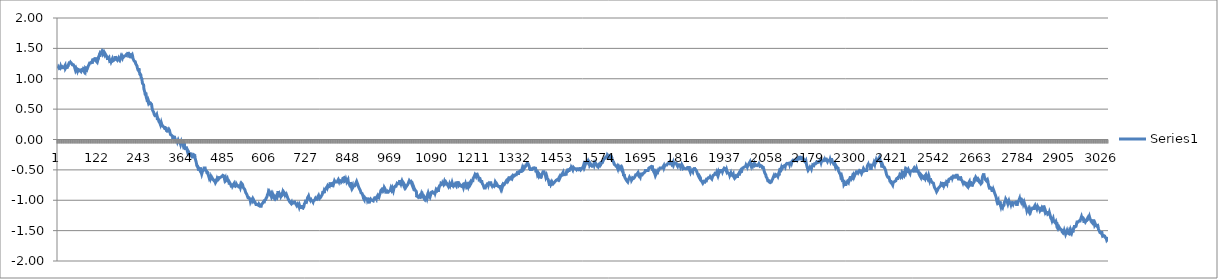
| Category | Series 0 |
|---|---|
| 0 | 1.17 |
| 1 | 1.19 |
| 2 | 1.19 |
| 3 | 1.17 |
| 4 | 1.17 |
| 5 | 1.18 |
| 6 | 1.18 |
| 7 | 1.2 |
| 8 | 1.18 |
| 9 | 1.18 |
| 10 | 1.18 |
| 11 | 1.2 |
| 12 | 1.2 |
| 13 | 1.21 |
| 14 | 1.18 |
| 15 | 1.18 |
| 16 | 1.18 |
| 17 | 1.18 |
| 18 | 1.2 |
| 19 | 1.2 |
| 20 | 1.22 |
| 21 | 1.17 |
| 22 | 1.18 |
| 23 | 1.19 |
| 24 | 1.22 |
| 25 | 1.17 |
| 26 | 1.18 |
| 27 | 1.22 |
| 28 | 1.2 |
| 29 | 1.23 |
| 30 | 1.24 |
| 31 | 1.25 |
| 32 | 1.25 |
| 33 | 1.28 |
| 34 | 1.24 |
| 35 | 1.23 |
| 36 | 1.27 |
| 37 | 1.26 |
| 38 | 1.27 |
| 39 | 1.25 |
| 40 | 1.24 |
| 41 | 1.23 |
| 42 | 1.22 |
| 43 | 1.23 |
| 44 | 1.23 |
| 45 | 1.22 |
| 46 | 1.24 |
| 47 | 1.2 |
| 48 | 1.2 |
| 49 | 1.19 |
| 50 | 1.14 |
| 51 | 1.15 |
| 52 | 1.17 |
| 53 | 1.17 |
| 54 | 1.17 |
| 55 | 1.13 |
| 56 | 1.16 |
| 57 | 1.16 |
| 58 | 1.16 |
| 59 | 1.15 |
| 60 | 1.13 |
| 61 | 1.14 |
| 62 | 1.12 |
| 63 | 1.14 |
| 64 | 1.15 |
| 65 | 1.14 |
| 66 | 1.12 |
| 67 | 1.13 |
| 68 | 1.15 |
| 69 | 1.14 |
| 70 | 1.15 |
| 71 | 1.16 |
| 72 | 1.11 |
| 73 | 1.14 |
| 74 | 1.15 |
| 75 | 1.12 |
| 76 | 1.14 |
| 77 | 1.14 |
| 78 | 1.12 |
| 79 | 1.17 |
| 80 | 1.17 |
| 81 | 1.18 |
| 82 | 1.15 |
| 83 | 1.17 |
| 84 | 1.2 |
| 85 | 1.18 |
| 86 | 1.19 |
| 87 | 1.21 |
| 88 | 1.2 |
| 89 | 1.23 |
| 90 | 1.22 |
| 91 | 1.26 |
| 92 | 1.25 |
| 93 | 1.25 |
| 94 | 1.26 |
| 95 | 1.26 |
| 96 | 1.26 |
| 97 | 1.28 |
| 98 | 1.25 |
| 99 | 1.29 |
| 100 | 1.3 |
| 101 | 1.33 |
| 102 | 1.29 |
| 103 | 1.31 |
| 104 | 1.32 |
| 105 | 1.3 |
| 106 | 1.32 |
| 107 | 1.35 |
| 108 | 1.31 |
| 109 | 1.31 |
| 110 | 1.29 |
| 111 | 1.3 |
| 112 | 1.29 |
| 113 | 1.27 |
| 114 | 1.29 |
| 115 | 1.34 |
| 116 | 1.32 |
| 117 | 1.36 |
| 118 | 1.37 |
| 119 | 1.39 |
| 120 | 1.36 |
| 121 | 1.41 |
| 122 | 1.42 |
| 123 | 1.42 |
| 124 | 1.43 |
| 125 | 1.42 |
| 126 | 1.45 |
| 127 | 1.46 |
| 128 | 1.42 |
| 129 | 1.44 |
| 130 | 1.43 |
| 131 | 1.42 |
| 132 | 1.42 |
| 133 | 1.4 |
| 134 | 1.43 |
| 135 | 1.42 |
| 136 | 1.41 |
| 137 | 1.4 |
| 138 | 1.39 |
| 139 | 1.38 |
| 140 | 1.37 |
| 141 | 1.37 |
| 142 | 1.34 |
| 143 | 1.31 |
| 144 | 1.33 |
| 145 | 1.32 |
| 146 | 1.34 |
| 147 | 1.35 |
| 148 | 1.34 |
| 149 | 1.29 |
| 150 | 1.28 |
| 151 | 1.3 |
| 152 | 1.3 |
| 153 | 1.28 |
| 154 | 1.28 |
| 155 | 1.29 |
| 156 | 1.32 |
| 157 | 1.29 |
| 158 | 1.29 |
| 159 | 1.3 |
| 160 | 1.3 |
| 161 | 1.3 |
| 162 | 1.3 |
| 163 | 1.32 |
| 164 | 1.34 |
| 165 | 1.37 |
| 166 | 1.35 |
| 167 | 1.32 |
| 168 | 1.32 |
| 169 | 1.33 |
| 170 | 1.31 |
| 171 | 1.34 |
| 172 | 1.32 |
| 173 | 1.31 |
| 174 | 1.34 |
| 175 | 1.32 |
| 176 | 1.33 |
| 177 | 1.31 |
| 178 | 1.3 |
| 179 | 1.29 |
| 180 | 1.31 |
| 181 | 1.35 |
| 182 | 1.33 |
| 183 | 1.36 |
| 184 | 1.36 |
| 185 | 1.34 |
| 186 | 1.37 |
| 187 | 1.37 |
| 188 | 1.35 |
| 189 | 1.34 |
| 190 | 1.36 |
| 191 | 1.37 |
| 192 | 1.37 |
| 193 | 1.36 |
| 194 | 1.38 |
| 195 | 1.37 |
| 196 | 1.38 |
| 197 | 1.38 |
| 198 | 1.4 |
| 199 | 1.42 |
| 200 | 1.39 |
| 201 | 1.41 |
| 202 | 1.44 |
| 203 | 1.42 |
| 204 | 1.38 |
| 205 | 1.38 |
| 206 | 1.38 |
| 207 | 1.39 |
| 208 | 1.38 |
| 209 | 1.34 |
| 210 | 1.4 |
| 211 | 1.38 |
| 212 | 1.38 |
| 213 | 1.37 |
| 214 | 1.4 |
| 215 | 1.38 |
| 216 | 1.34 |
| 217 | 1.34 |
| 218 | 1.31 |
| 219 | 1.31 |
| 220 | 1.29 |
| 221 | 1.29 |
| 222 | 1.29 |
| 223 | 1.28 |
| 224 | 1.25 |
| 225 | 1.24 |
| 226 | 1.23 |
| 227 | 1.24 |
| 228 | 1.21 |
| 229 | 1.18 |
| 230 | 1.16 |
| 231 | 1.16 |
| 232 | 1.13 |
| 233 | 1.17 |
| 234 | 1.12 |
| 235 | 1.13 |
| 236 | 1.09 |
| 237 | 1.06 |
| 238 | 1.08 |
| 239 | 1.05 |
| 240 | 1.02 |
| 241 | 1.02 |
| 242 | 1 |
| 243 | 0.95 |
| 244 | 0.92 |
| 245 | 0.91 |
| 246 | 0.92 |
| 247 | 0.9 |
| 248 | 0.83 |
| 249 | 0.81 |
| 250 | 0.82 |
| 251 | 0.77 |
| 252 | 0.73 |
| 253 | 0.77 |
| 254 | 0.72 |
| 255 | 0.69 |
| 256 | 0.69 |
| 257 | 0.65 |
| 258 | 0.62 |
| 259 | 0.64 |
| 260 | 0.62 |
| 261 | 0.64 |
| 262 | 0.65 |
| 263 | 0.64 |
| 264 | 0.59 |
| 265 | 0.59 |
| 266 | 0.58 |
| 267 | 0.6 |
| 268 | 0.59 |
| 269 | 0.61 |
| 270 | 0.58 |
| 271 | 0.59 |
| 272 | 0.5 |
| 273 | 0.49 |
| 274 | 0.47 |
| 275 | 0.46 |
| 276 | 0.45 |
| 277 | 0.43 |
| 278 | 0.41 |
| 279 | 0.4 |
| 280 | 0.39 |
| 281 | 0.4 |
| 282 | 0.38 |
| 283 | 0.39 |
| 284 | 0.39 |
| 285 | 0.41 |
| 286 | 0.38 |
| 287 | 0.32 |
| 288 | 0.35 |
| 289 | 0.35 |
| 290 | 0.33 |
| 291 | 0.3 |
| 292 | 0.31 |
| 293 | 0.29 |
| 294 | 0.27 |
| 295 | 0.26 |
| 296 | 0.24 |
| 297 | 0.25 |
| 298 | 0.28 |
| 299 | 0.29 |
| 300 | 0.24 |
| 301 | 0.23 |
| 302 | 0.23 |
| 303 | 0.22 |
| 304 | 0.21 |
| 305 | 0.22 |
| 306 | 0.2 |
| 307 | 0.22 |
| 308 | 0.19 |
| 309 | 0.21 |
| 310 | 0.16 |
| 311 | 0.2 |
| 312 | 0.18 |
| 313 | 0.16 |
| 314 | 0.13 |
| 315 | 0.16 |
| 316 | 0.15 |
| 317 | 0.12 |
| 318 | 0.15 |
| 319 | 0.15 |
| 320 | 0.17 |
| 321 | 0.16 |
| 322 | 0.15 |
| 323 | 0.12 |
| 324 | 0.11 |
| 325 | 0.08 |
| 326 | 0.08 |
| 327 | 0.08 |
| 328 | 0.07 |
| 329 | 0.08 |
| 330 | 0.07 |
| 331 | 0.05 |
| 332 | 0.01 |
| 333 | 0.04 |
| 334 | 0.06 |
| 335 | 0.03 |
| 336 | 0.05 |
| 337 | 0.04 |
| 338 | 0 |
| 339 | 0.01 |
| 340 | -0.01 |
| 341 | -0.03 |
| 342 | -0.03 |
| 343 | -0.03 |
| 344 | -0.02 |
| 345 | -0.04 |
| 346 | -0.04 |
| 347 | -0.01 |
| 348 | -0.01 |
| 349 | -0.04 |
| 350 | -0.05 |
| 351 | -0.04 |
| 352 | -0.04 |
| 353 | -0.04 |
| 354 | -0.08 |
| 355 | -0.06 |
| 356 | -0.04 |
| 357 | -0.06 |
| 358 | -0.03 |
| 359 | -0.04 |
| 360 | -0.07 |
| 361 | -0.09 |
| 362 | -0.08 |
| 363 | -0.05 |
| 364 | -0.06 |
| 365 | -0.07 |
| 366 | -0.13 |
| 367 | -0.15 |
| 368 | -0.17 |
| 369 | -0.16 |
| 370 | -0.12 |
| 371 | -0.14 |
| 372 | -0.16 |
| 373 | -0.17 |
| 374 | -0.2 |
| 375 | -0.18 |
| 376 | -0.19 |
| 377 | -0.2 |
| 378 | -0.25 |
| 379 | -0.22 |
| 380 | -0.23 |
| 381 | -0.26 |
| 382 | -0.25 |
| 383 | -0.27 |
| 384 | -0.24 |
| 385 | -0.25 |
| 386 | -0.24 |
| 387 | -0.26 |
| 388 | -0.29 |
| 389 | -0.29 |
| 390 | -0.28 |
| 391 | -0.29 |
| 392 | -0.25 |
| 393 | -0.25 |
| 394 | -0.24 |
| 395 | -0.26 |
| 396 | -0.31 |
| 397 | -0.3 |
| 398 | -0.32 |
| 399 | -0.37 |
| 400 | -0.38 |
| 401 | -0.43 |
| 402 | -0.43 |
| 403 | -0.44 |
| 404 | -0.46 |
| 405 | -0.48 |
| 406 | -0.51 |
| 407 | -0.48 |
| 408 | -0.49 |
| 409 | -0.5 |
| 410 | -0.49 |
| 411 | -0.46 |
| 412 | -0.51 |
| 413 | -0.5 |
| 414 | -0.55 |
| 415 | -0.57 |
| 416 | -0.56 |
| 417 | -0.53 |
| 418 | -0.5 |
| 419 | -0.49 |
| 420 | -0.49 |
| 421 | -0.5 |
| 422 | -0.47 |
| 423 | -0.47 |
| 424 | -0.46 |
| 425 | -0.47 |
| 426 | -0.5 |
| 427 | -0.51 |
| 428 | -0.49 |
| 429 | -0.52 |
| 430 | -0.54 |
| 431 | -0.56 |
| 432 | -0.53 |
| 433 | -0.57 |
| 434 | -0.58 |
| 435 | -0.6 |
| 436 | -0.61 |
| 437 | -0.64 |
| 438 | -0.63 |
| 439 | -0.62 |
| 440 | -0.64 |
| 441 | -0.62 |
| 442 | -0.64 |
| 443 | -0.63 |
| 444 | -0.62 |
| 445 | -0.63 |
| 446 | -0.64 |
| 447 | -0.64 |
| 448 | -0.66 |
| 449 | -0.66 |
| 450 | -0.67 |
| 451 | -0.68 |
| 452 | -0.65 |
| 453 | -0.67 |
| 454 | -0.68 |
| 455 | -0.71 |
| 456 | -0.7 |
| 457 | -0.7 |
| 458 | -0.68 |
| 459 | -0.66 |
| 460 | -0.68 |
| 461 | -0.64 |
| 462 | -0.61 |
| 463 | -0.62 |
| 464 | -0.65 |
| 465 | -0.65 |
| 466 | -0.64 |
| 467 | -0.63 |
| 468 | -0.63 |
| 469 | -0.64 |
| 470 | -0.62 |
| 471 | -0.62 |
| 472 | -0.63 |
| 473 | -0.61 |
| 474 | -0.6 |
| 475 | -0.6 |
| 476 | -0.59 |
| 477 | -0.58 |
| 478 | -0.6 |
| 479 | -0.6 |
| 480 | -0.61 |
| 481 | -0.65 |
| 482 | -0.64 |
| 483 | -0.63 |
| 484 | -0.68 |
| 485 | -0.67 |
| 486 | -0.68 |
| 487 | -0.66 |
| 488 | -0.67 |
| 489 | -0.64 |
| 490 | -0.66 |
| 491 | -0.68 |
| 492 | -0.69 |
| 493 | -0.69 |
| 494 | -0.71 |
| 495 | -0.74 |
| 496 | -0.71 |
| 497 | -0.72 |
| 498 | -0.72 |
| 499 | -0.74 |
| 500 | -0.76 |
| 501 | -0.76 |
| 502 | -0.75 |
| 503 | -0.75 |
| 504 | -0.77 |
| 505 | -0.76 |
| 506 | -0.75 |
| 507 | -0.74 |
| 508 | -0.73 |
| 509 | -0.76 |
| 510 | -0.77 |
| 511 | -0.76 |
| 512 | -0.77 |
| 513 | -0.77 |
| 514 | -0.75 |
| 515 | -0.73 |
| 516 | -0.72 |
| 517 | -0.74 |
| 518 | -0.76 |
| 519 | -0.75 |
| 520 | -0.76 |
| 521 | -0.76 |
| 522 | -0.78 |
| 523 | -0.77 |
| 524 | -0.78 |
| 525 | -0.79 |
| 526 | -0.77 |
| 527 | -0.79 |
| 528 | -0.77 |
| 529 | -0.74 |
| 530 | -0.72 |
| 531 | -0.73 |
| 532 | -0.73 |
| 533 | -0.74 |
| 534 | -0.76 |
| 535 | -0.79 |
| 536 | -0.78 |
| 537 | -0.8 |
| 538 | -0.81 |
| 539 | -0.81 |
| 540 | -0.83 |
| 541 | -0.83 |
| 542 | -0.87 |
| 543 | -0.88 |
| 544 | -0.89 |
| 545 | -0.88 |
| 546 | -0.91 |
| 547 | -0.93 |
| 548 | -0.93 |
| 549 | -0.96 |
| 550 | -0.96 |
| 551 | -0.96 |
| 552 | -0.96 |
| 553 | -0.97 |
| 554 | -0.97 |
| 555 | -0.99 |
| 556 | -1.02 |
| 557 | -1.01 |
| 558 | -0.99 |
| 559 | -0.96 |
| 560 | -0.98 |
| 561 | -1 |
| 562 | -0.99 |
| 563 | -0.97 |
| 564 | -0.97 |
| 565 | -0.99 |
| 566 | -1.03 |
| 567 | -1.04 |
| 568 | -1.04 |
| 569 | -1.03 |
| 570 | -1.04 |
| 571 | -1.03 |
| 572 | -1.07 |
| 573 | -1.06 |
| 574 | -1.06 |
| 575 | -1.07 |
| 576 | -1.07 |
| 577 | -1.08 |
| 578 | -1.08 |
| 579 | -1.07 |
| 580 | -1.06 |
| 581 | -1.07 |
| 582 | -1.08 |
| 583 | -1.08 |
| 584 | -1.1 |
| 585 | -1.11 |
| 586 | -1.11 |
| 587 | -1.1 |
| 588 | -1.07 |
| 589 | -1.08 |
| 590 | -1.08 |
| 591 | -1.05 |
| 592 | -1.05 |
| 593 | -1.03 |
| 594 | -1.04 |
| 595 | -1.02 |
| 596 | -1.03 |
| 597 | -1 |
| 598 | -1.01 |
| 599 | -1 |
| 600 | -0.99 |
| 601 | -0.97 |
| 602 | -0.98 |
| 603 | -0.98 |
| 604 | -0.94 |
| 605 | -0.91 |
| 606 | -0.92 |
| 607 | -0.89 |
| 608 | -0.86 |
| 609 | -0.86 |
| 610 | -0.88 |
| 611 | -0.86 |
| 612 | -0.86 |
| 613 | -0.88 |
| 614 | -0.89 |
| 615 | -0.89 |
| 616 | -0.93 |
| 617 | -0.91 |
| 618 | -0.93 |
| 619 | -0.92 |
| 620 | -0.9 |
| 621 | -0.92 |
| 622 | -0.94 |
| 623 | -0.93 |
| 624 | -0.96 |
| 625 | -0.94 |
| 626 | -0.94 |
| 627 | -0.95 |
| 628 | -0.97 |
| 629 | -0.97 |
| 630 | -0.96 |
| 631 | -0.93 |
| 632 | -0.94 |
| 633 | -0.95 |
| 634 | -0.95 |
| 635 | -0.91 |
| 636 | -0.85 |
| 637 | -0.87 |
| 638 | -0.92 |
| 639 | -0.95 |
| 640 | -0.95 |
| 641 | -0.9 |
| 642 | -0.9 |
| 643 | -0.92 |
| 644 | -0.94 |
| 645 | -0.93 |
| 646 | -0.94 |
| 647 | -0.91 |
| 648 | -0.9 |
| 649 | -0.87 |
| 650 | -0.89 |
| 651 | -0.89 |
| 652 | -0.87 |
| 653 | -0.87 |
| 654 | -0.87 |
| 655 | -0.91 |
| 656 | -0.89 |
| 657 | -0.9 |
| 658 | -0.89 |
| 659 | -0.91 |
| 660 | -0.94 |
| 661 | -0.92 |
| 662 | -0.92 |
| 663 | -0.95 |
| 664 | -0.96 |
| 665 | -0.98 |
| 666 | -0.97 |
| 667 | -0.97 |
| 668 | -1.01 |
| 669 | -1.01 |
| 670 | -1.03 |
| 671 | -1.02 |
| 672 | -1.03 |
| 673 | -1.05 |
| 674 | -1.04 |
| 675 | -1.03 |
| 676 | -1.05 |
| 677 | -1.04 |
| 678 | -1.04 |
| 679 | -1.03 |
| 680 | -1.01 |
| 681 | -1.04 |
| 682 | -1.04 |
| 683 | -1.03 |
| 684 | -1.03 |
| 685 | -1.02 |
| 686 | -1.04 |
| 687 | -1.06 |
| 688 | -1.07 |
| 689 | -1.06 |
| 690 | -1.09 |
| 691 | -1.09 |
| 692 | -1.1 |
| 693 | -1.06 |
| 694 | -1.06 |
| 695 | -1.06 |
| 696 | -1.09 |
| 697 | -1.11 |
| 698 | -1.09 |
| 699 | -1.11 |
| 700 | -1.11 |
| 701 | -1.14 |
| 702 | -1.09 |
| 703 | -1.12 |
| 704 | -1.08 |
| 705 | -1.12 |
| 706 | -1.13 |
| 707 | -1.13 |
| 708 | -1.13 |
| 709 | -1.12 |
| 710 | -1.11 |
| 711 | -1.1 |
| 712 | -1.06 |
| 713 | -1.06 |
| 714 | -1.04 |
| 715 | -1.02 |
| 716 | -1.02 |
| 717 | -1.03 |
| 718 | -1.03 |
| 719 | -1.04 |
| 720 | -0.99 |
| 721 | -0.96 |
| 722 | -0.96 |
| 723 | -0.94 |
| 724 | -0.97 |
| 725 | -0.95 |
| 726 | -0.97 |
| 727 | -0.97 |
| 728 | -0.99 |
| 729 | -0.96 |
| 730 | -0.98 |
| 731 | -0.98 |
| 732 | -1 |
| 733 | -1.01 |
| 734 | -1 |
| 735 | -1.01 |
| 736 | -1.01 |
| 737 | -1.03 |
| 738 | -1.01 |
| 739 | -1.01 |
| 740 | -1 |
| 741 | -1 |
| 742 | -0.99 |
| 743 | -0.98 |
| 744 | -1 |
| 745 | -0.97 |
| 746 | -0.97 |
| 747 | -0.98 |
| 748 | -0.98 |
| 749 | -0.98 |
| 750 | -0.95 |
| 751 | -0.94 |
| 752 | -0.96 |
| 753 | -0.92 |
| 754 | -0.93 |
| 755 | -0.91 |
| 756 | -0.97 |
| 757 | -0.96 |
| 758 | -0.98 |
| 759 | -0.95 |
| 760 | -0.95 |
| 761 | -0.93 |
| 762 | -0.94 |
| 763 | -0.91 |
| 764 | -0.91 |
| 765 | -0.88 |
| 766 | -0.85 |
| 767 | -0.88 |
| 768 | -0.86 |
| 769 | -0.88 |
| 770 | -0.85 |
| 771 | -0.86 |
| 772 | -0.84 |
| 773 | -0.81 |
| 774 | -0.81 |
| 775 | -0.82 |
| 776 | -0.79 |
| 777 | -0.79 |
| 778 | -0.77 |
| 779 | -0.79 |
| 780 | -0.78 |
| 781 | -0.76 |
| 782 | -0.76 |
| 783 | -0.77 |
| 784 | -0.77 |
| 785 | -0.74 |
| 786 | -0.76 |
| 787 | -0.71 |
| 788 | -0.75 |
| 789 | -0.78 |
| 790 | -0.77 |
| 791 | -0.73 |
| 792 | -0.72 |
| 793 | -0.72 |
| 794 | -0.72 |
| 795 | -0.72 |
| 796 | -0.74 |
| 797 | -0.73 |
| 798 | -0.7 |
| 799 | -0.68 |
| 800 | -0.67 |
| 801 | -0.7 |
| 802 | -0.71 |
| 803 | -0.71 |
| 804 | -0.7 |
| 805 | -0.71 |
| 806 | -0.7 |
| 807 | -0.7 |
| 808 | -0.68 |
| 809 | -0.68 |
| 810 | -0.66 |
| 811 | -0.67 |
| 812 | -0.69 |
| 813 | -0.67 |
| 814 | -0.66 |
| 815 | -0.68 |
| 816 | -0.68 |
| 817 | -0.71 |
| 818 | -0.68 |
| 819 | -0.7 |
| 820 | -0.71 |
| 821 | -0.69 |
| 822 | -0.68 |
| 823 | -0.64 |
| 824 | -0.65 |
| 825 | -0.63 |
| 826 | -0.63 |
| 827 | -0.65 |
| 828 | -0.69 |
| 829 | -0.68 |
| 830 | -0.68 |
| 831 | -0.68 |
| 832 | -0.66 |
| 833 | -0.68 |
| 834 | -0.65 |
| 835 | -0.69 |
| 836 | -0.68 |
| 837 | -0.68 |
| 838 | -0.66 |
| 839 | -0.7 |
| 840 | -0.7 |
| 841 | -0.71 |
| 842 | -0.74 |
| 843 | -0.74 |
| 844 | -0.73 |
| 845 | -0.7 |
| 846 | -0.75 |
| 847 | -0.76 |
| 848 | -0.79 |
| 849 | -0.77 |
| 850 | -0.77 |
| 851 | -0.75 |
| 852 | -0.79 |
| 853 | -0.78 |
| 854 | -0.78 |
| 855 | -0.76 |
| 856 | -0.76 |
| 857 | -0.75 |
| 858 | -0.76 |
| 859 | -0.75 |
| 860 | -0.73 |
| 861 | -0.74 |
| 862 | -0.73 |
| 863 | -0.69 |
| 864 | -0.7 |
| 865 | -0.72 |
| 866 | -0.72 |
| 867 | -0.75 |
| 868 | -0.77 |
| 869 | -0.77 |
| 870 | -0.8 |
| 871 | -0.79 |
| 872 | -0.81 |
| 873 | -0.83 |
| 874 | -0.83 |
| 875 | -0.84 |
| 876 | -0.88 |
| 877 | -0.87 |
| 878 | -0.88 |
| 879 | -0.89 |
| 880 | -0.89 |
| 881 | -0.9 |
| 882 | -0.94 |
| 883 | -0.97 |
| 884 | -0.98 |
| 885 | -0.99 |
| 886 | -0.95 |
| 887 | -0.96 |
| 888 | -0.96 |
| 889 | -0.97 |
| 890 | -0.98 |
| 891 | -0.97 |
| 892 | -0.98 |
| 893 | -0.96 |
| 894 | -0.99 |
| 895 | -0.99 |
| 896 | -0.96 |
| 897 | -1 |
| 898 | -1 |
| 899 | -1.05 |
| 900 | -1 |
| 901 | -1.01 |
| 902 | -1.01 |
| 903 | -0.98 |
| 904 | -0.98 |
| 905 | -1 |
| 906 | -1 |
| 907 | -0.99 |
| 908 | -1 |
| 909 | -1 |
| 910 | -1.01 |
| 911 | -1.01 |
| 912 | -0.99 |
| 913 | -0.99 |
| 914 | -0.99 |
| 915 | -0.96 |
| 916 | -0.95 |
| 917 | -0.97 |
| 918 | -0.96 |
| 919 | -0.97 |
| 920 | -0.98 |
| 921 | -0.95 |
| 922 | -0.95 |
| 923 | -0.93 |
| 924 | -0.95 |
| 925 | -0.96 |
| 926 | -0.96 |
| 927 | -0.96 |
| 928 | -0.94 |
| 929 | -0.94 |
| 930 | -0.9 |
| 931 | -0.9 |
| 932 | -0.87 |
| 933 | -0.84 |
| 934 | -0.83 |
| 935 | -0.84 |
| 936 | -0.82 |
| 937 | -0.82 |
| 938 | -0.83 |
| 939 | -0.85 |
| 940 | -0.85 |
| 941 | -0.84 |
| 942 | -0.82 |
| 943 | -0.79 |
| 944 | -0.8 |
| 945 | -0.81 |
| 946 | -0.82 |
| 947 | -0.86 |
| 948 | -0.85 |
| 949 | -0.85 |
| 950 | -0.85 |
| 951 | -0.87 |
| 952 | -0.86 |
| 953 | -0.86 |
| 954 | -0.87 |
| 955 | -0.86 |
| 956 | -0.86 |
| 957 | -0.85 |
| 958 | -0.85 |
| 959 | -0.86 |
| 960 | -0.84 |
| 961 | -0.83 |
| 962 | -0.8 |
| 963 | -0.81 |
| 964 | -0.83 |
| 965 | -0.82 |
| 966 | -0.8 |
| 967 | -0.82 |
| 968 | -0.82 |
| 969 | -0.85 |
| 970 | -0.84 |
| 971 | -0.8 |
| 972 | -0.8 |
| 973 | -0.79 |
| 974 | -0.77 |
| 975 | -0.76 |
| 976 | -0.78 |
| 977 | -0.77 |
| 978 | -0.77 |
| 979 | -0.76 |
| 980 | -0.72 |
| 981 | -0.71 |
| 982 | -0.71 |
| 983 | -0.73 |
| 984 | -0.72 |
| 985 | -0.73 |
| 986 | -0.73 |
| 987 | -0.69 |
| 988 | -0.67 |
| 989 | -0.7 |
| 990 | -0.71 |
| 991 | -0.73 |
| 992 | -0.71 |
| 993 | -0.7 |
| 994 | -0.68 |
| 995 | -0.69 |
| 996 | -0.71 |
| 997 | -0.73 |
| 998 | -0.74 |
| 999 | -0.73 |
| 1000 | -0.77 |
| 1001 | -0.74 |
| 1002 | -0.74 |
| 1003 | -0.76 |
| 1004 | -0.75 |
| 1005 | -0.79 |
| 1006 | -0.78 |
| 1007 | -0.77 |
| 1008 | -0.77 |
| 1009 | -0.77 |
| 1010 | -0.75 |
| 1011 | -0.74 |
| 1012 | -0.74 |
| 1013 | -0.71 |
| 1014 | -0.72 |
| 1015 | -0.68 |
| 1016 | -0.69 |
| 1017 | -0.7 |
| 1018 | -0.7 |
| 1019 | -0.7 |
| 1020 | -0.69 |
| 1021 | -0.7 |
| 1022 | -0.7 |
| 1023 | -0.74 |
| 1024 | -0.74 |
| 1025 | -0.77 |
| 1026 | -0.75 |
| 1027 | -0.74 |
| 1028 | -0.78 |
| 1029 | -0.78 |
| 1030 | -0.82 |
| 1031 | -0.85 |
| 1032 | -0.83 |
| 1033 | -0.84 |
| 1034 | -0.84 |
| 1035 | -0.85 |
| 1036 | -0.87 |
| 1037 | -0.95 |
| 1038 | -0.93 |
| 1039 | -0.94 |
| 1040 | -0.93 |
| 1041 | -0.95 |
| 1042 | -0.96 |
| 1043 | -0.96 |
| 1044 | -0.93 |
| 1045 | -0.97 |
| 1046 | -0.96 |
| 1047 | -0.94 |
| 1048 | -0.94 |
| 1049 | -0.92 |
| 1050 | -0.9 |
| 1051 | -0.92 |
| 1052 | -0.91 |
| 1053 | -0.9 |
| 1054 | -0.92 |
| 1055 | -0.94 |
| 1056 | -0.94 |
| 1057 | -0.94 |
| 1058 | -0.97 |
| 1059 | -0.95 |
| 1060 | -0.95 |
| 1061 | -0.96 |
| 1062 | -0.98 |
| 1063 | -0.96 |
| 1064 | -0.93 |
| 1065 | -0.97 |
| 1066 | -0.95 |
| 1067 | -0.97 |
| 1068 | -0.95 |
| 1069 | -0.9 |
| 1070 | -0.88 |
| 1071 | -0.88 |
| 1072 | -0.87 |
| 1073 | -0.93 |
| 1074 | -0.92 |
| 1075 | -0.95 |
| 1076 | -0.94 |
| 1077 | -0.91 |
| 1078 | -0.89 |
| 1079 | -0.87 |
| 1080 | -0.87 |
| 1081 | -0.88 |
| 1082 | -0.86 |
| 1083 | -0.85 |
| 1084 | -0.86 |
| 1085 | -0.88 |
| 1086 | -0.87 |
| 1087 | -0.88 |
| 1088 | -0.89 |
| 1089 | -0.86 |
| 1090 | -0.88 |
| 1091 | -0.89 |
| 1092 | -0.84 |
| 1093 | -0.82 |
| 1094 | -0.83 |
| 1095 | -0.81 |
| 1096 | -0.84 |
| 1097 | -0.83 |
| 1098 | -0.82 |
| 1099 | -0.86 |
| 1100 | -0.82 |
| 1101 | -0.8 |
| 1102 | -0.79 |
| 1103 | -0.76 |
| 1104 | -0.77 |
| 1105 | -0.77 |
| 1106 | -0.75 |
| 1107 | -0.72 |
| 1108 | -0.71 |
| 1109 | -0.73 |
| 1110 | -0.73 |
| 1111 | -0.75 |
| 1112 | -0.72 |
| 1113 | -0.73 |
| 1114 | -0.74 |
| 1115 | -0.73 |
| 1116 | -0.71 |
| 1117 | -0.69 |
| 1118 | -0.7 |
| 1119 | -0.72 |
| 1120 | -0.72 |
| 1121 | -0.7 |
| 1122 | -0.7 |
| 1123 | -0.72 |
| 1124 | -0.73 |
| 1125 | -0.73 |
| 1126 | -0.75 |
| 1127 | -0.75 |
| 1128 | -0.77 |
| 1129 | -0.75 |
| 1130 | -0.76 |
| 1131 | -0.75 |
| 1132 | -0.77 |
| 1133 | -0.73 |
| 1134 | -0.74 |
| 1135 | -0.75 |
| 1136 | -0.78 |
| 1137 | -0.76 |
| 1138 | -0.73 |
| 1139 | -0.71 |
| 1140 | -0.72 |
| 1141 | -0.75 |
| 1142 | -0.74 |
| 1143 | -0.77 |
| 1144 | -0.77 |
| 1145 | -0.76 |
| 1146 | -0.75 |
| 1147 | -0.74 |
| 1148 | -0.73 |
| 1149 | -0.72 |
| 1150 | -0.73 |
| 1151 | -0.76 |
| 1152 | -0.74 |
| 1153 | -0.71 |
| 1154 | -0.74 |
| 1155 | -0.71 |
| 1156 | -0.69 |
| 1157 | -0.73 |
| 1158 | -0.76 |
| 1159 | -0.77 |
| 1160 | -0.77 |
| 1161 | -0.74 |
| 1162 | -0.74 |
| 1163 | -0.76 |
| 1164 | -0.75 |
| 1165 | -0.77 |
| 1166 | -0.77 |
| 1167 | -0.77 |
| 1168 | -0.76 |
| 1169 | -0.75 |
| 1170 | -0.76 |
| 1171 | -0.77 |
| 1172 | -0.79 |
| 1173 | -0.77 |
| 1174 | -0.77 |
| 1175 | -0.71 |
| 1176 | -0.77 |
| 1177 | -0.75 |
| 1178 | -0.73 |
| 1179 | -0.74 |
| 1180 | -0.77 |
| 1181 | -0.76 |
| 1182 | -0.75 |
| 1183 | -0.77 |
| 1184 | -0.77 |
| 1185 | -0.75 |
| 1186 | -0.77 |
| 1187 | -0.75 |
| 1188 | -0.75 |
| 1189 | -0.73 |
| 1190 | -0.73 |
| 1191 | -0.71 |
| 1192 | -0.74 |
| 1193 | -0.73 |
| 1194 | -0.72 |
| 1195 | -0.7 |
| 1196 | -0.68 |
| 1197 | -0.68 |
| 1198 | -0.68 |
| 1199 | -0.68 |
| 1200 | -0.64 |
| 1201 | -0.65 |
| 1202 | -0.64 |
| 1203 | -0.61 |
| 1204 | -0.62 |
| 1205 | -0.58 |
| 1206 | -0.59 |
| 1207 | -0.58 |
| 1208 | -0.61 |
| 1209 | -0.59 |
| 1210 | -0.55 |
| 1211 | -0.57 |
| 1212 | -0.58 |
| 1213 | -0.59 |
| 1214 | -0.61 |
| 1215 | -0.6 |
| 1216 | -0.63 |
| 1217 | -0.66 |
| 1218 | -0.65 |
| 1219 | -0.66 |
| 1220 | -0.65 |
| 1221 | -0.66 |
| 1222 | -0.69 |
| 1223 | -0.7 |
| 1224 | -0.69 |
| 1225 | -0.69 |
| 1226 | -0.72 |
| 1227 | -0.72 |
| 1228 | -0.71 |
| 1229 | -0.75 |
| 1230 | -0.74 |
| 1231 | -0.75 |
| 1232 | -0.8 |
| 1233 | -0.79 |
| 1234 | -0.8 |
| 1235 | -0.8 |
| 1236 | -0.78 |
| 1237 | -0.78 |
| 1238 | -0.76 |
| 1239 | -0.78 |
| 1240 | -0.75 |
| 1241 | -0.75 |
| 1242 | -0.74 |
| 1243 | -0.73 |
| 1244 | -0.75 |
| 1245 | -0.73 |
| 1246 | -0.74 |
| 1247 | -0.73 |
| 1248 | -0.71 |
| 1249 | -0.7 |
| 1250 | -0.72 |
| 1251 | -0.71 |
| 1252 | -0.74 |
| 1253 | -0.74 |
| 1254 | -0.76 |
| 1255 | -0.74 |
| 1256 | -0.78 |
| 1257 | -0.76 |
| 1258 | -0.77 |
| 1259 | -0.76 |
| 1260 | -0.77 |
| 1261 | -0.75 |
| 1262 | -0.75 |
| 1263 | -0.73 |
| 1264 | -0.7 |
| 1265 | -0.71 |
| 1266 | -0.72 |
| 1267 | -0.73 |
| 1268 | -0.75 |
| 1269 | -0.78 |
| 1270 | -0.75 |
| 1271 | -0.75 |
| 1272 | -0.77 |
| 1273 | -0.77 |
| 1274 | -0.76 |
| 1275 | -0.78 |
| 1276 | -0.78 |
| 1277 | -0.75 |
| 1278 | -0.79 |
| 1279 | -0.78 |
| 1280 | -0.82 |
| 1281 | -0.81 |
| 1282 | -0.79 |
| 1283 | -0.81 |
| 1284 | -0.79 |
| 1285 | -0.79 |
| 1286 | -0.78 |
| 1287 | -0.73 |
| 1288 | -0.73 |
| 1289 | -0.73 |
| 1290 | -0.74 |
| 1291 | -0.74 |
| 1292 | -0.72 |
| 1293 | -0.73 |
| 1294 | -0.71 |
| 1295 | -0.69 |
| 1296 | -0.68 |
| 1297 | -0.72 |
| 1298 | -0.68 |
| 1299 | -0.69 |
| 1300 | -0.66 |
| 1301 | -0.68 |
| 1302 | -0.67 |
| 1303 | -0.66 |
| 1304 | -0.63 |
| 1305 | -0.63 |
| 1306 | -0.62 |
| 1307 | -0.63 |
| 1308 | -0.67 |
| 1309 | -0.66 |
| 1310 | -0.62 |
| 1311 | -0.61 |
| 1312 | -0.61 |
| 1313 | -0.6 |
| 1314 | -0.62 |
| 1315 | -0.61 |
| 1316 | -0.59 |
| 1317 | -0.58 |
| 1318 | -0.6 |
| 1319 | -0.6 |
| 1320 | -0.61 |
| 1321 | -0.6 |
| 1322 | -0.58 |
| 1323 | -0.59 |
| 1324 | -0.57 |
| 1325 | -0.58 |
| 1326 | -0.58 |
| 1327 | -0.55 |
| 1328 | -0.56 |
| 1329 | -0.55 |
| 1330 | -0.56 |
| 1331 | -0.58 |
| 1332 | -0.53 |
| 1333 | -0.52 |
| 1334 | -0.52 |
| 1335 | -0.53 |
| 1336 | -0.55 |
| 1337 | -0.5 |
| 1338 | -0.54 |
| 1339 | -0.51 |
| 1340 | -0.51 |
| 1341 | -0.49 |
| 1342 | -0.47 |
| 1343 | -0.49 |
| 1344 | -0.48 |
| 1345 | -0.5 |
| 1346 | -0.46 |
| 1347 | -0.48 |
| 1348 | -0.47 |
| 1349 | -0.46 |
| 1350 | -0.46 |
| 1351 | -0.46 |
| 1352 | -0.44 |
| 1353 | -0.43 |
| 1354 | -0.42 |
| 1355 | -0.41 |
| 1356 | -0.39 |
| 1357 | -0.4 |
| 1358 | -0.38 |
| 1359 | -0.4 |
| 1360 | -0.42 |
| 1361 | -0.42 |
| 1362 | -0.44 |
| 1363 | -0.45 |
| 1364 | -0.5 |
| 1365 | -0.48 |
| 1366 | -0.51 |
| 1367 | -0.49 |
| 1368 | -0.47 |
| 1369 | -0.51 |
| 1370 | -0.48 |
| 1371 | -0.49 |
| 1372 | -0.48 |
| 1373 | -0.48 |
| 1374 | -0.5 |
| 1375 | -0.45 |
| 1376 | -0.46 |
| 1377 | -0.48 |
| 1378 | -0.5 |
| 1379 | -0.46 |
| 1380 | -0.48 |
| 1381 | -0.5 |
| 1382 | -0.54 |
| 1383 | -0.52 |
| 1384 | -0.53 |
| 1385 | -0.55 |
| 1386 | -0.58 |
| 1387 | -0.58 |
| 1388 | -0.56 |
| 1389 | -0.58 |
| 1390 | -0.56 |
| 1391 | -0.57 |
| 1392 | -0.57 |
| 1393 | -0.58 |
| 1394 | -0.61 |
| 1395 | -0.64 |
| 1396 | -0.63 |
| 1397 | -0.64 |
| 1398 | -0.59 |
| 1399 | -0.58 |
| 1400 | -0.56 |
| 1401 | -0.55 |
| 1402 | -0.53 |
| 1403 | -0.52 |
| 1404 | -0.54 |
| 1405 | -0.53 |
| 1406 | -0.55 |
| 1407 | -0.56 |
| 1408 | -0.57 |
| 1409 | -0.58 |
| 1410 | -0.62 |
| 1411 | -0.61 |
| 1412 | -0.59 |
| 1413 | -0.61 |
| 1414 | -0.64 |
| 1415 | -0.64 |
| 1416 | -0.65 |
| 1417 | -0.66 |
| 1418 | -0.69 |
| 1419 | -0.71 |
| 1420 | -0.71 |
| 1421 | -0.76 |
| 1422 | -0.73 |
| 1423 | -0.74 |
| 1424 | -0.71 |
| 1425 | -0.74 |
| 1426 | -0.73 |
| 1427 | -0.72 |
| 1428 | -0.74 |
| 1429 | -0.71 |
| 1430 | -0.7 |
| 1431 | -0.73 |
| 1432 | -0.73 |
| 1433 | -0.72 |
| 1434 | -0.71 |
| 1435 | -0.7 |
| 1436 | -0.72 |
| 1437 | -0.69 |
| 1438 | -0.68 |
| 1439 | -0.7 |
| 1440 | -0.67 |
| 1441 | -0.67 |
| 1442 | -0.66 |
| 1443 | -0.66 |
| 1444 | -0.65 |
| 1445 | -0.67 |
| 1446 | -0.67 |
| 1447 | -0.65 |
| 1448 | -0.63 |
| 1449 | -0.63 |
| 1450 | -0.61 |
| 1451 | -0.63 |
| 1452 | -0.63 |
| 1453 | -0.62 |
| 1454 | -0.59 |
| 1455 | -0.59 |
| 1456 | -0.59 |
| 1457 | -0.59 |
| 1458 | -0.56 |
| 1459 | -0.56 |
| 1460 | -0.54 |
| 1461 | -0.55 |
| 1462 | -0.6 |
| 1463 | -0.57 |
| 1464 | -0.58 |
| 1465 | -0.57 |
| 1466 | -0.57 |
| 1467 | -0.58 |
| 1468 | -0.56 |
| 1469 | -0.57 |
| 1470 | -0.54 |
| 1471 | -0.51 |
| 1472 | -0.54 |
| 1473 | -0.52 |
| 1474 | -0.48 |
| 1475 | -0.51 |
| 1476 | -0.51 |
| 1477 | -0.5 |
| 1478 | -0.51 |
| 1479 | -0.49 |
| 1480 | -0.49 |
| 1481 | -0.49 |
| 1482 | -0.47 |
| 1483 | -0.49 |
| 1484 | -0.46 |
| 1485 | -0.46 |
| 1486 | -0.48 |
| 1487 | -0.44 |
| 1488 | -0.46 |
| 1489 | -0.48 |
| 1490 | -0.46 |
| 1491 | -0.45 |
| 1492 | -0.46 |
| 1493 | -0.48 |
| 1494 | -0.48 |
| 1495 | -0.48 |
| 1496 | -0.48 |
| 1497 | -0.48 |
| 1498 | -0.49 |
| 1499 | -0.5 |
| 1500 | -0.49 |
| 1501 | -0.49 |
| 1502 | -0.48 |
| 1503 | -0.49 |
| 1504 | -0.49 |
| 1505 | -0.48 |
| 1506 | -0.51 |
| 1507 | -0.48 |
| 1508 | -0.52 |
| 1509 | -0.47 |
| 1510 | -0.5 |
| 1511 | -0.46 |
| 1512 | -0.49 |
| 1513 | -0.48 |
| 1514 | -0.49 |
| 1515 | -0.47 |
| 1516 | -0.47 |
| 1517 | -0.46 |
| 1518 | -0.45 |
| 1519 | -0.43 |
| 1520 | -0.45 |
| 1521 | -0.43 |
| 1522 | -0.45 |
| 1523 | -0.45 |
| 1524 | -0.45 |
| 1525 | -0.4 |
| 1526 | -0.4 |
| 1527 | -0.41 |
| 1528 | -0.38 |
| 1529 | -0.38 |
| 1530 | -0.36 |
| 1531 | -0.36 |
| 1532 | -0.37 |
| 1533 | -0.39 |
| 1534 | -0.36 |
| 1535 | -0.36 |
| 1536 | -0.38 |
| 1537 | -0.42 |
| 1538 | -0.41 |
| 1539 | -0.4 |
| 1540 | -0.4 |
| 1541 | -0.42 |
| 1542 | -0.41 |
| 1543 | -0.42 |
| 1544 | -0.44 |
| 1545 | -0.43 |
| 1546 | -0.43 |
| 1547 | -0.43 |
| 1548 | -0.42 |
| 1549 | -0.4 |
| 1550 | -0.42 |
| 1551 | -0.4 |
| 1552 | -0.4 |
| 1553 | -0.38 |
| 1554 | -0.39 |
| 1555 | -0.4 |
| 1556 | -0.41 |
| 1557 | -0.42 |
| 1558 | -0.43 |
| 1559 | -0.44 |
| 1560 | -0.43 |
| 1561 | -0.43 |
| 1562 | -0.42 |
| 1563 | -0.44 |
| 1564 | -0.45 |
| 1565 | -0.43 |
| 1566 | -0.41 |
| 1567 | -0.43 |
| 1568 | -0.39 |
| 1569 | -0.41 |
| 1570 | -0.41 |
| 1571 | -0.39 |
| 1572 | -0.36 |
| 1573 | -0.39 |
| 1574 | -0.37 |
| 1575 | -0.37 |
| 1576 | -0.35 |
| 1577 | -0.35 |
| 1578 | -0.32 |
| 1579 | -0.32 |
| 1580 | -0.31 |
| 1581 | -0.31 |
| 1582 | -0.3 |
| 1583 | -0.29 |
| 1584 | -0.28 |
| 1585 | -0.29 |
| 1586 | -0.29 |
| 1587 | -0.3 |
| 1588 | -0.25 |
| 1589 | -0.26 |
| 1590 | -0.26 |
| 1591 | -0.27 |
| 1592 | -0.29 |
| 1593 | -0.28 |
| 1594 | -0.28 |
| 1595 | -0.27 |
| 1596 | -0.27 |
| 1597 | -0.28 |
| 1598 | -0.3 |
| 1599 | -0.27 |
| 1600 | -0.27 |
| 1601 | -0.31 |
| 1602 | -0.33 |
| 1603 | -0.35 |
| 1604 | -0.35 |
| 1605 | -0.36 |
| 1606 | -0.37 |
| 1607 | -0.38 |
| 1608 | -0.41 |
| 1609 | -0.41 |
| 1610 | -0.41 |
| 1611 | -0.42 |
| 1612 | -0.42 |
| 1613 | -0.44 |
| 1614 | -0.45 |
| 1615 | -0.43 |
| 1616 | -0.45 |
| 1617 | -0.46 |
| 1618 | -0.48 |
| 1619 | -0.45 |
| 1620 | -0.45 |
| 1621 | -0.47 |
| 1622 | -0.45 |
| 1623 | -0.45 |
| 1624 | -0.47 |
| 1625 | -0.46 |
| 1626 | -0.48 |
| 1627 | -0.45 |
| 1628 | -0.47 |
| 1629 | -0.5 |
| 1630 | -0.51 |
| 1631 | -0.52 |
| 1632 | -0.5 |
| 1633 | -0.52 |
| 1634 | -0.55 |
| 1635 | -0.6 |
| 1636 | -0.57 |
| 1637 | -0.6 |
| 1638 | -0.6 |
| 1639 | -0.63 |
| 1640 | -0.63 |
| 1641 | -0.65 |
| 1642 | -0.66 |
| 1643 | -0.66 |
| 1644 | -0.68 |
| 1645 | -0.68 |
| 1646 | -0.67 |
| 1647 | -0.7 |
| 1648 | -0.68 |
| 1649 | -0.66 |
| 1650 | -0.66 |
| 1651 | -0.66 |
| 1652 | -0.62 |
| 1653 | -0.63 |
| 1654 | -0.64 |
| 1655 | -0.64 |
| 1656 | -0.63 |
| 1657 | -0.64 |
| 1658 | -0.67 |
| 1659 | -0.68 |
| 1660 | -0.65 |
| 1661 | -0.63 |
| 1662 | -0.62 |
| 1663 | -0.62 |
| 1664 | -0.64 |
| 1665 | -0.65 |
| 1666 | -0.63 |
| 1667 | -0.62 |
| 1668 | -0.61 |
| 1669 | -0.62 |
| 1670 | -0.58 |
| 1671 | -0.59 |
| 1672 | -0.59 |
| 1673 | -0.58 |
| 1674 | -0.57 |
| 1675 | -0.56 |
| 1676 | -0.56 |
| 1677 | -0.58 |
| 1678 | -0.56 |
| 1679 | -0.55 |
| 1680 | -0.59 |
| 1681 | -0.59 |
| 1682 | -0.6 |
| 1683 | -0.62 |
| 1684 | -0.59 |
| 1685 | -0.59 |
| 1686 | -0.57 |
| 1687 | -0.58 |
| 1688 | -0.57 |
| 1689 | -0.58 |
| 1690 | -0.59 |
| 1691 | -0.56 |
| 1692 | -0.56 |
| 1693 | -0.56 |
| 1694 | -0.55 |
| 1695 | -0.55 |
| 1696 | -0.55 |
| 1697 | -0.53 |
| 1698 | -0.53 |
| 1699 | -0.49 |
| 1700 | -0.53 |
| 1701 | -0.5 |
| 1702 | -0.53 |
| 1703 | -0.51 |
| 1704 | -0.51 |
| 1705 | -0.5 |
| 1706 | -0.51 |
| 1707 | -0.5 |
| 1708 | -0.47 |
| 1709 | -0.46 |
| 1710 | -0.48 |
| 1711 | -0.46 |
| 1712 | -0.45 |
| 1713 | -0.47 |
| 1714 | -0.45 |
| 1715 | -0.48 |
| 1716 | -0.47 |
| 1717 | -0.49 |
| 1718 | -0.43 |
| 1719 | -0.51 |
| 1720 | -0.48 |
| 1721 | -0.51 |
| 1722 | -0.53 |
| 1723 | -0.54 |
| 1724 | -0.54 |
| 1725 | -0.56 |
| 1726 | -0.58 |
| 1727 | -0.56 |
| 1728 | -0.58 |
| 1729 | -0.59 |
| 1730 | -0.58 |
| 1731 | -0.54 |
| 1732 | -0.57 |
| 1733 | -0.54 |
| 1734 | -0.54 |
| 1735 | -0.52 |
| 1736 | -0.52 |
| 1737 | -0.5 |
| 1738 | -0.51 |
| 1739 | -0.51 |
| 1740 | -0.47 |
| 1741 | -0.48 |
| 1742 | -0.47 |
| 1743 | -0.47 |
| 1744 | -0.48 |
| 1745 | -0.47 |
| 1746 | -0.47 |
| 1747 | -0.48 |
| 1748 | -0.47 |
| 1749 | -0.45 |
| 1750 | -0.45 |
| 1751 | -0.43 |
| 1752 | -0.46 |
| 1753 | -0.45 |
| 1754 | -0.43 |
| 1755 | -0.42 |
| 1756 | -0.42 |
| 1757 | -0.42 |
| 1758 | -0.42 |
| 1759 | -0.42 |
| 1760 | -0.42 |
| 1761 | -0.42 |
| 1762 | -0.4 |
| 1763 | -0.39 |
| 1764 | -0.39 |
| 1765 | -0.39 |
| 1766 | -0.38 |
| 1767 | -0.38 |
| 1768 | -0.37 |
| 1769 | -0.38 |
| 1770 | -0.38 |
| 1771 | -0.42 |
| 1772 | -0.39 |
| 1773 | -0.39 |
| 1774 | -0.41 |
| 1775 | -0.41 |
| 1776 | -0.4 |
| 1777 | -0.38 |
| 1778 | -0.4 |
| 1779 | -0.38 |
| 1780 | -0.4 |
| 1781 | -0.38 |
| 1782 | -0.39 |
| 1783 | -0.37 |
| 1784 | -0.39 |
| 1785 | -0.39 |
| 1786 | -0.39 |
| 1787 | -0.39 |
| 1788 | -0.4 |
| 1789 | -0.42 |
| 1790 | -0.42 |
| 1791 | -0.44 |
| 1792 | -0.43 |
| 1793 | -0.4 |
| 1794 | -0.44 |
| 1795 | -0.42 |
| 1796 | -0.43 |
| 1797 | -0.41 |
| 1798 | -0.42 |
| 1799 | -0.44 |
| 1800 | -0.46 |
| 1801 | -0.47 |
| 1802 | -0.44 |
| 1803 | -0.46 |
| 1804 | -0.42 |
| 1805 | -0.43 |
| 1806 | -0.44 |
| 1807 | -0.48 |
| 1808 | -0.47 |
| 1809 | -0.47 |
| 1810 | -0.47 |
| 1811 | -0.46 |
| 1812 | -0.47 |
| 1813 | -0.48 |
| 1814 | -0.49 |
| 1815 | -0.47 |
| 1816 | -0.48 |
| 1817 | -0.47 |
| 1818 | -0.47 |
| 1819 | -0.48 |
| 1820 | -0.46 |
| 1821 | -0.47 |
| 1822 | -0.46 |
| 1823 | -0.46 |
| 1824 | -0.44 |
| 1825 | -0.48 |
| 1826 | -0.51 |
| 1827 | -0.51 |
| 1828 | -0.54 |
| 1829 | -0.55 |
| 1830 | -0.5 |
| 1831 | -0.54 |
| 1832 | -0.53 |
| 1833 | -0.51 |
| 1834 | -0.51 |
| 1835 | -0.53 |
| 1836 | -0.5 |
| 1837 | -0.49 |
| 1838 | -0.49 |
| 1839 | -0.49 |
| 1840 | -0.46 |
| 1841 | -0.49 |
| 1842 | -0.48 |
| 1843 | -0.5 |
| 1844 | -0.5 |
| 1845 | -0.51 |
| 1846 | -0.52 |
| 1847 | -0.52 |
| 1848 | -0.53 |
| 1849 | -0.57 |
| 1850 | -0.58 |
| 1851 | -0.57 |
| 1852 | -0.61 |
| 1853 | -0.61 |
| 1854 | -0.63 |
| 1855 | -0.61 |
| 1856 | -0.62 |
| 1857 | -0.63 |
| 1858 | -0.67 |
| 1859 | -0.68 |
| 1860 | -0.66 |
| 1861 | -0.69 |
| 1862 | -0.69 |
| 1863 | -0.7 |
| 1864 | -0.72 |
| 1865 | -0.72 |
| 1866 | -0.71 |
| 1867 | -0.69 |
| 1868 | -0.68 |
| 1869 | -0.69 |
| 1870 | -0.7 |
| 1871 | -0.71 |
| 1872 | -0.68 |
| 1873 | -0.7 |
| 1874 | -0.67 |
| 1875 | -0.66 |
| 1876 | -0.66 |
| 1877 | -0.65 |
| 1878 | -0.64 |
| 1879 | -0.64 |
| 1880 | -0.63 |
| 1881 | -0.64 |
| 1882 | -0.64 |
| 1883 | -0.63 |
| 1884 | -0.64 |
| 1885 | -0.61 |
| 1886 | -0.6 |
| 1887 | -0.63 |
| 1888 | -0.62 |
| 1889 | -0.63 |
| 1890 | -0.65 |
| 1891 | -0.63 |
| 1892 | -0.63 |
| 1893 | -0.63 |
| 1894 | -0.59 |
| 1895 | -0.58 |
| 1896 | -0.6 |
| 1897 | -0.58 |
| 1898 | -0.57 |
| 1899 | -0.56 |
| 1900 | -0.55 |
| 1901 | -0.55 |
| 1902 | -0.57 |
| 1903 | -0.57 |
| 1904 | -0.54 |
| 1905 | -0.56 |
| 1906 | -0.56 |
| 1907 | -0.59 |
| 1908 | -0.56 |
| 1909 | -0.54 |
| 1910 | -0.56 |
| 1911 | -0.54 |
| 1912 | -0.52 |
| 1913 | -0.51 |
| 1914 | -0.51 |
| 1915 | -0.52 |
| 1916 | -0.49 |
| 1917 | -0.52 |
| 1918 | -0.53 |
| 1919 | -0.52 |
| 1920 | -0.51 |
| 1921 | -0.53 |
| 1922 | -0.52 |
| 1923 | -0.5 |
| 1924 | -0.49 |
| 1925 | -0.51 |
| 1926 | -0.47 |
| 1927 | -0.47 |
| 1928 | -0.46 |
| 1929 | -0.48 |
| 1930 | -0.48 |
| 1931 | -0.49 |
| 1932 | -0.52 |
| 1933 | -0.5 |
| 1934 | -0.52 |
| 1935 | -0.53 |
| 1936 | -0.55 |
| 1937 | -0.56 |
| 1938 | -0.54 |
| 1939 | -0.56 |
| 1940 | -0.54 |
| 1941 | -0.54 |
| 1942 | -0.59 |
| 1943 | -0.58 |
| 1944 | -0.59 |
| 1945 | -0.55 |
| 1946 | -0.57 |
| 1947 | -0.59 |
| 1948 | -0.58 |
| 1949 | -0.59 |
| 1950 | -0.59 |
| 1951 | -0.58 |
| 1952 | -0.57 |
| 1953 | -0.61 |
| 1954 | -0.6 |
| 1955 | -0.61 |
| 1956 | -0.64 |
| 1957 | -0.64 |
| 1958 | -0.63 |
| 1959 | -0.62 |
| 1960 | -0.6 |
| 1961 | -0.61 |
| 1962 | -0.6 |
| 1963 | -0.61 |
| 1964 | -0.63 |
| 1965 | -0.58 |
| 1966 | -0.58 |
| 1967 | -0.57 |
| 1968 | -0.56 |
| 1969 | -0.59 |
| 1970 | -0.54 |
| 1971 | -0.54 |
| 1972 | -0.52 |
| 1973 | -0.54 |
| 1974 | -0.54 |
| 1975 | -0.53 |
| 1976 | -0.53 |
| 1977 | -0.5 |
| 1978 | -0.49 |
| 1979 | -0.47 |
| 1980 | -0.47 |
| 1981 | -0.46 |
| 1982 | -0.46 |
| 1983 | -0.46 |
| 1984 | -0.47 |
| 1985 | -0.45 |
| 1986 | -0.44 |
| 1987 | -0.46 |
| 1988 | -0.44 |
| 1989 | -0.42 |
| 1990 | -0.42 |
| 1991 | -0.43 |
| 1992 | -0.45 |
| 1993 | -0.41 |
| 1994 | -0.43 |
| 1995 | -0.44 |
| 1996 | -0.42 |
| 1997 | -0.4 |
| 1998 | -0.4 |
| 1999 | -0.41 |
| 2000 | -0.37 |
| 2001 | -0.4 |
| 2002 | -0.4 |
| 2003 | -0.43 |
| 2004 | -0.4 |
| 2005 | -0.39 |
| 2006 | -0.39 |
| 2007 | -0.43 |
| 2008 | -0.39 |
| 2009 | -0.38 |
| 2010 | -0.42 |
| 2011 | -0.41 |
| 2012 | -0.41 |
| 2013 | -0.39 |
| 2014 | -0.4 |
| 2015 | -0.43 |
| 2016 | -0.44 |
| 2017 | -0.42 |
| 2018 | -0.42 |
| 2019 | -0.41 |
| 2020 | -0.43 |
| 2021 | -0.43 |
| 2022 | -0.42 |
| 2023 | -0.42 |
| 2024 | -0.42 |
| 2025 | -0.42 |
| 2026 | -0.4 |
| 2027 | -0.4 |
| 2028 | -0.41 |
| 2029 | -0.44 |
| 2030 | -0.44 |
| 2031 | -0.43 |
| 2032 | -0.43 |
| 2033 | -0.43 |
| 2034 | -0.42 |
| 2035 | -0.44 |
| 2036 | -0.46 |
| 2037 | -0.46 |
| 2038 | -0.45 |
| 2039 | -0.46 |
| 2040 | -0.48 |
| 2041 | -0.51 |
| 2042 | -0.51 |
| 2043 | -0.55 |
| 2044 | -0.56 |
| 2045 | -0.55 |
| 2046 | -0.58 |
| 2047 | -0.61 |
| 2048 | -0.6 |
| 2049 | -0.6 |
| 2050 | -0.64 |
| 2051 | -0.65 |
| 2052 | -0.68 |
| 2053 | -0.68 |
| 2054 | -0.69 |
| 2055 | -0.68 |
| 2056 | -0.7 |
| 2057 | -0.7 |
| 2058 | -0.7 |
| 2059 | -0.71 |
| 2060 | -0.7 |
| 2061 | -0.7 |
| 2062 | -0.7 |
| 2063 | -0.69 |
| 2064 | -0.67 |
| 2065 | -0.67 |
| 2066 | -0.65 |
| 2067 | -0.63 |
| 2068 | -0.63 |
| 2069 | -0.62 |
| 2070 | -0.59 |
| 2071 | -0.58 |
| 2072 | -0.61 |
| 2073 | -0.61 |
| 2074 | -0.6 |
| 2075 | -0.6 |
| 2076 | -0.58 |
| 2077 | -0.57 |
| 2078 | -0.58 |
| 2079 | -0.59 |
| 2080 | -0.58 |
| 2081 | -0.61 |
| 2082 | -0.59 |
| 2083 | -0.57 |
| 2084 | -0.59 |
| 2085 | -0.56 |
| 2086 | -0.52 |
| 2087 | -0.49 |
| 2088 | -0.48 |
| 2089 | -0.48 |
| 2090 | -0.49 |
| 2091 | -0.47 |
| 2092 | -0.49 |
| 2093 | -0.49 |
| 2094 | -0.48 |
| 2095 | -0.46 |
| 2096 | -0.42 |
| 2097 | -0.44 |
| 2098 | -0.43 |
| 2099 | -0.43 |
| 2100 | -0.43 |
| 2101 | -0.42 |
| 2102 | -0.45 |
| 2103 | -0.42 |
| 2104 | -0.42 |
| 2105 | -0.43 |
| 2106 | -0.4 |
| 2107 | -0.4 |
| 2108 | -0.41 |
| 2109 | -0.4 |
| 2110 | -0.37 |
| 2111 | -0.41 |
| 2112 | -0.39 |
| 2113 | -0.42 |
| 2114 | -0.39 |
| 2115 | -0.41 |
| 2116 | -0.39 |
| 2117 | -0.38 |
| 2118 | -0.4 |
| 2119 | -0.39 |
| 2120 | -0.36 |
| 2121 | -0.38 |
| 2122 | -0.36 |
| 2123 | -0.35 |
| 2124 | -0.35 |
| 2125 | -0.34 |
| 2126 | -0.35 |
| 2127 | -0.33 |
| 2128 | -0.35 |
| 2129 | -0.36 |
| 2130 | -0.34 |
| 2131 | -0.34 |
| 2132 | -0.34 |
| 2133 | -0.34 |
| 2134 | -0.32 |
| 2135 | -0.33 |
| 2136 | -0.33 |
| 2137 | -0.31 |
| 2138 | -0.33 |
| 2139 | -0.33 |
| 2140 | -0.31 |
| 2141 | -0.32 |
| 2142 | -0.3 |
| 2143 | -0.3 |
| 2144 | -0.27 |
| 2145 | -0.3 |
| 2146 | -0.3 |
| 2147 | -0.34 |
| 2148 | -0.28 |
| 2149 | -0.31 |
| 2150 | -0.32 |
| 2151 | -0.3 |
| 2152 | -0.32 |
| 2153 | -0.31 |
| 2154 | -0.32 |
| 2155 | -0.32 |
| 2156 | -0.31 |
| 2157 | -0.35 |
| 2158 | -0.36 |
| 2159 | -0.35 |
| 2160 | -0.37 |
| 2161 | -0.36 |
| 2162 | -0.35 |
| 2163 | -0.39 |
| 2164 | -0.38 |
| 2165 | -0.44 |
| 2166 | -0.45 |
| 2167 | -0.48 |
| 2168 | -0.49 |
| 2169 | -0.45 |
| 2170 | -0.49 |
| 2171 | -0.49 |
| 2172 | -0.49 |
| 2173 | -0.46 |
| 2174 | -0.47 |
| 2175 | -0.49 |
| 2176 | -0.45 |
| 2177 | -0.45 |
| 2178 | -0.48 |
| 2179 | -0.47 |
| 2180 | -0.43 |
| 2181 | -0.45 |
| 2182 | -0.42 |
| 2183 | -0.41 |
| 2184 | -0.41 |
| 2185 | -0.43 |
| 2186 | -0.42 |
| 2187 | -0.4 |
| 2188 | -0.4 |
| 2189 | -0.39 |
| 2190 | -0.4 |
| 2191 | -0.39 |
| 2192 | -0.39 |
| 2193 | -0.37 |
| 2194 | -0.38 |
| 2195 | -0.37 |
| 2196 | -0.38 |
| 2197 | -0.37 |
| 2198 | -0.39 |
| 2199 | -0.37 |
| 2200 | -0.36 |
| 2201 | -0.36 |
| 2202 | -0.35 |
| 2203 | -0.39 |
| 2204 | -0.4 |
| 2205 | -0.36 |
| 2206 | -0.38 |
| 2207 | -0.36 |
| 2208 | -0.35 |
| 2209 | -0.36 |
| 2210 | -0.35 |
| 2211 | -0.36 |
| 2212 | -0.36 |
| 2213 | -0.35 |
| 2214 | -0.36 |
| 2215 | -0.33 |
| 2216 | -0.36 |
| 2217 | -0.36 |
| 2218 | -0.32 |
| 2219 | -0.31 |
| 2220 | -0.32 |
| 2221 | -0.32 |
| 2222 | -0.34 |
| 2223 | -0.35 |
| 2224 | -0.36 |
| 2225 | -0.34 |
| 2226 | -0.34 |
| 2227 | -0.35 |
| 2228 | -0.35 |
| 2229 | -0.35 |
| 2230 | -0.34 |
| 2231 | -0.35 |
| 2232 | -0.33 |
| 2233 | -0.35 |
| 2234 | -0.33 |
| 2235 | -0.34 |
| 2236 | -0.34 |
| 2237 | -0.33 |
| 2238 | -0.35 |
| 2239 | -0.35 |
| 2240 | -0.38 |
| 2241 | -0.39 |
| 2242 | -0.4 |
| 2243 | -0.41 |
| 2244 | -0.39 |
| 2245 | -0.39 |
| 2246 | -0.42 |
| 2247 | -0.44 |
| 2248 | -0.46 |
| 2249 | -0.45 |
| 2250 | -0.44 |
| 2251 | -0.45 |
| 2252 | -0.46 |
| 2253 | -0.47 |
| 2254 | -0.46 |
| 2255 | -0.47 |
| 2256 | -0.51 |
| 2257 | -0.51 |
| 2258 | -0.51 |
| 2259 | -0.55 |
| 2260 | -0.56 |
| 2261 | -0.56 |
| 2262 | -0.58 |
| 2263 | -0.61 |
| 2264 | -0.61 |
| 2265 | -0.59 |
| 2266 | -0.59 |
| 2267 | -0.63 |
| 2268 | -0.66 |
| 2269 | -0.7 |
| 2270 | -0.67 |
| 2271 | -0.69 |
| 2272 | -0.74 |
| 2273 | -0.74 |
| 2274 | -0.72 |
| 2275 | -0.74 |
| 2276 | -0.75 |
| 2277 | -0.75 |
| 2278 | -0.74 |
| 2279 | -0.72 |
| 2280 | -0.71 |
| 2281 | -0.72 |
| 2282 | -0.69 |
| 2283 | -0.7 |
| 2284 | -0.69 |
| 2285 | -0.71 |
| 2286 | -0.68 |
| 2287 | -0.67 |
| 2288 | -0.67 |
| 2289 | -0.64 |
| 2290 | -0.64 |
| 2291 | -0.61 |
| 2292 | -0.67 |
| 2293 | -0.61 |
| 2294 | -0.64 |
| 2295 | -0.63 |
| 2296 | -0.62 |
| 2297 | -0.6 |
| 2298 | -0.61 |
| 2299 | -0.62 |
| 2300 | -0.6 |
| 2301 | -0.62 |
| 2302 | -0.62 |
| 2303 | -0.62 |
| 2304 | -0.58 |
| 2305 | -0.58 |
| 2306 | -0.56 |
| 2307 | -0.55 |
| 2308 | -0.53 |
| 2309 | -0.54 |
| 2310 | -0.53 |
| 2311 | -0.53 |
| 2312 | -0.52 |
| 2313 | -0.55 |
| 2314 | -0.54 |
| 2315 | -0.53 |
| 2316 | -0.54 |
| 2317 | -0.51 |
| 2318 | -0.51 |
| 2319 | -0.52 |
| 2320 | -0.52 |
| 2321 | -0.53 |
| 2322 | -0.53 |
| 2323 | -0.56 |
| 2324 | -0.57 |
| 2325 | -0.55 |
| 2326 | -0.52 |
| 2327 | -0.54 |
| 2328 | -0.5 |
| 2329 | -0.48 |
| 2330 | -0.49 |
| 2331 | -0.49 |
| 2332 | -0.51 |
| 2333 | -0.51 |
| 2334 | -0.5 |
| 2335 | -0.51 |
| 2336 | -0.5 |
| 2337 | -0.52 |
| 2338 | -0.51 |
| 2339 | -0.47 |
| 2340 | -0.43 |
| 2341 | -0.43 |
| 2342 | -0.41 |
| 2343 | -0.44 |
| 2344 | -0.42 |
| 2345 | -0.42 |
| 2346 | -0.43 |
| 2347 | -0.42 |
| 2348 | -0.43 |
| 2349 | -0.45 |
| 2350 | -0.5 |
| 2351 | -0.45 |
| 2352 | -0.44 |
| 2353 | -0.46 |
| 2354 | -0.42 |
| 2355 | -0.41 |
| 2356 | -0.42 |
| 2357 | -0.42 |
| 2358 | -0.41 |
| 2359 | -0.38 |
| 2360 | -0.39 |
| 2361 | -0.41 |
| 2362 | -0.38 |
| 2363 | -0.37 |
| 2364 | -0.36 |
| 2365 | -0.34 |
| 2366 | -0.36 |
| 2367 | -0.35 |
| 2368 | -0.34 |
| 2369 | -0.33 |
| 2370 | -0.35 |
| 2371 | -0.33 |
| 2372 | -0.32 |
| 2373 | -0.31 |
| 2374 | -0.31 |
| 2375 | -0.29 |
| 2376 | -0.29 |
| 2377 | -0.35 |
| 2378 | -0.37 |
| 2379 | -0.36 |
| 2380 | -0.39 |
| 2381 | -0.43 |
| 2382 | -0.46 |
| 2383 | -0.45 |
| 2384 | -0.42 |
| 2385 | -0.42 |
| 2386 | -0.45 |
| 2387 | -0.45 |
| 2388 | -0.45 |
| 2389 | -0.46 |
| 2390 | -0.46 |
| 2391 | -0.47 |
| 2392 | -0.5 |
| 2393 | -0.52 |
| 2394 | -0.53 |
| 2395 | -0.57 |
| 2396 | -0.59 |
| 2397 | -0.58 |
| 2398 | -0.6 |
| 2399 | -0.62 |
| 2400 | -0.61 |
| 2401 | -0.61 |
| 2402 | -0.62 |
| 2403 | -0.63 |
| 2404 | -0.66 |
| 2405 | -0.67 |
| 2406 | -0.7 |
| 2407 | -0.67 |
| 2408 | -0.71 |
| 2409 | -0.72 |
| 2410 | -0.71 |
| 2411 | -0.73 |
| 2412 | -0.74 |
| 2413 | -0.75 |
| 2414 | -0.72 |
| 2415 | -0.73 |
| 2416 | -0.7 |
| 2417 | -0.69 |
| 2418 | -0.69 |
| 2419 | -0.69 |
| 2420 | -0.68 |
| 2421 | -0.69 |
| 2422 | -0.68 |
| 2423 | -0.66 |
| 2424 | -0.65 |
| 2425 | -0.64 |
| 2426 | -0.65 |
| 2427 | -0.63 |
| 2428 | -0.64 |
| 2429 | -0.62 |
| 2430 | -0.61 |
| 2431 | -0.62 |
| 2432 | -0.61 |
| 2433 | -0.59 |
| 2434 | -0.59 |
| 2435 | -0.61 |
| 2436 | -0.59 |
| 2437 | -0.58 |
| 2438 | -0.6 |
| 2439 | -0.61 |
| 2440 | -0.56 |
| 2441 | -0.55 |
| 2442 | -0.58 |
| 2443 | -0.56 |
| 2444 | -0.56 |
| 2445 | -0.57 |
| 2446 | -0.59 |
| 2447 | -0.57 |
| 2448 | -0.55 |
| 2449 | -0.52 |
| 2450 | -0.53 |
| 2451 | -0.55 |
| 2452 | -0.53 |
| 2453 | -0.49 |
| 2454 | -0.5 |
| 2455 | -0.49 |
| 2456 | -0.51 |
| 2457 | -0.52 |
| 2458 | -0.49 |
| 2459 | -0.48 |
| 2460 | -0.52 |
| 2461 | -0.54 |
| 2462 | -0.55 |
| 2463 | -0.56 |
| 2464 | -0.53 |
| 2465 | -0.54 |
| 2466 | -0.54 |
| 2467 | -0.52 |
| 2468 | -0.51 |
| 2469 | -0.51 |
| 2470 | -0.52 |
| 2471 | -0.52 |
| 2472 | -0.5 |
| 2473 | -0.5 |
| 2474 | -0.48 |
| 2475 | -0.5 |
| 2476 | -0.5 |
| 2477 | -0.54 |
| 2478 | -0.48 |
| 2479 | -0.48 |
| 2480 | -0.48 |
| 2481 | -0.5 |
| 2482 | -0.48 |
| 2483 | -0.48 |
| 2484 | -0.52 |
| 2485 | -0.52 |
| 2486 | -0.51 |
| 2487 | -0.52 |
| 2488 | -0.55 |
| 2489 | -0.55 |
| 2490 | -0.56 |
| 2491 | -0.59 |
| 2492 | -0.59 |
| 2493 | -0.59 |
| 2494 | -0.62 |
| 2495 | -0.58 |
| 2496 | -0.58 |
| 2497 | -0.58 |
| 2498 | -0.6 |
| 2499 | -0.63 |
| 2500 | -0.63 |
| 2501 | -0.63 |
| 2502 | -0.64 |
| 2503 | -0.63 |
| 2504 | -0.62 |
| 2505 | -0.63 |
| 2506 | -0.64 |
| 2507 | -0.6 |
| 2508 | -0.61 |
| 2509 | -0.58 |
| 2510 | -0.58 |
| 2511 | -0.62 |
| 2512 | -0.62 |
| 2513 | -0.62 |
| 2514 | -0.65 |
| 2515 | -0.63 |
| 2516 | -0.61 |
| 2517 | -0.59 |
| 2518 | -0.61 |
| 2519 | -0.66 |
| 2520 | -0.68 |
| 2521 | -0.66 |
| 2522 | -0.64 |
| 2523 | -0.67 |
| 2524 | -0.68 |
| 2525 | -0.69 |
| 2526 | -0.7 |
| 2527 | -0.69 |
| 2528 | -0.71 |
| 2529 | -0.7 |
| 2530 | -0.71 |
| 2531 | -0.72 |
| 2532 | -0.75 |
| 2533 | -0.77 |
| 2534 | -0.79 |
| 2535 | -0.79 |
| 2536 | -0.81 |
| 2537 | -0.82 |
| 2538 | -0.83 |
| 2539 | -0.82 |
| 2540 | -0.86 |
| 2541 | -0.86 |
| 2542 | -0.86 |
| 2543 | -0.83 |
| 2544 | -0.81 |
| 2545 | -0.81 |
| 2546 | -0.81 |
| 2547 | -0.79 |
| 2548 | -0.8 |
| 2549 | -0.8 |
| 2550 | -0.77 |
| 2551 | -0.76 |
| 2552 | -0.75 |
| 2553 | -0.73 |
| 2554 | -0.74 |
| 2555 | -0.74 |
| 2556 | -0.75 |
| 2557 | -0.74 |
| 2558 | -0.72 |
| 2559 | -0.7 |
| 2560 | -0.73 |
| 2561 | -0.71 |
| 2562 | -0.75 |
| 2563 | -0.76 |
| 2564 | -0.75 |
| 2565 | -0.71 |
| 2566 | -0.76 |
| 2567 | -0.73 |
| 2568 | -0.71 |
| 2569 | -0.71 |
| 2570 | -0.73 |
| 2571 | -0.69 |
| 2572 | -0.69 |
| 2573 | -0.68 |
| 2574 | -0.69 |
| 2575 | -0.66 |
| 2576 | -0.66 |
| 2577 | -0.66 |
| 2578 | -0.65 |
| 2579 | -0.63 |
| 2580 | -0.66 |
| 2581 | -0.64 |
| 2582 | -0.63 |
| 2583 | -0.65 |
| 2584 | -0.63 |
| 2585 | -0.6 |
| 2586 | -0.63 |
| 2587 | -0.62 |
| 2588 | -0.6 |
| 2589 | -0.6 |
| 2590 | -0.61 |
| 2591 | -0.6 |
| 2592 | -0.62 |
| 2593 | -0.62 |
| 2594 | -0.61 |
| 2595 | -0.62 |
| 2596 | -0.61 |
| 2597 | -0.59 |
| 2598 | -0.58 |
| 2599 | -0.59 |
| 2600 | -0.59 |
| 2601 | -0.6 |
| 2602 | -0.62 |
| 2603 | -0.63 |
| 2604 | -0.67 |
| 2605 | -0.64 |
| 2606 | -0.64 |
| 2607 | -0.64 |
| 2608 | -0.64 |
| 2609 | -0.61 |
| 2610 | -0.63 |
| 2611 | -0.66 |
| 2612 | -0.66 |
| 2613 | -0.66 |
| 2614 | -0.68 |
| 2615 | -0.68 |
| 2616 | -0.71 |
| 2617 | -0.69 |
| 2618 | -0.72 |
| 2619 | -0.71 |
| 2620 | -0.72 |
| 2621 | -0.73 |
| 2622 | -0.71 |
| 2623 | -0.71 |
| 2624 | -0.71 |
| 2625 | -0.72 |
| 2626 | -0.74 |
| 2627 | -0.76 |
| 2628 | -0.75 |
| 2629 | -0.76 |
| 2630 | -0.78 |
| 2631 | -0.77 |
| 2632 | -0.72 |
| 2633 | -0.71 |
| 2634 | -0.71 |
| 2635 | -0.69 |
| 2636 | -0.72 |
| 2637 | -0.73 |
| 2638 | -0.69 |
| 2639 | -0.73 |
| 2640 | -0.76 |
| 2641 | -0.73 |
| 2642 | -0.77 |
| 2643 | -0.75 |
| 2644 | -0.75 |
| 2645 | -0.7 |
| 2646 | -0.72 |
| 2647 | -0.71 |
| 2648 | -0.7 |
| 2649 | -0.69 |
| 2650 | -0.63 |
| 2651 | -0.65 |
| 2652 | -0.64 |
| 2653 | -0.62 |
| 2654 | -0.62 |
| 2655 | -0.64 |
| 2656 | -0.64 |
| 2657 | -0.67 |
| 2658 | -0.67 |
| 2659 | -0.67 |
| 2660 | -0.68 |
| 2661 | -0.66 |
| 2662 | -0.66 |
| 2663 | -0.68 |
| 2664 | -0.72 |
| 2665 | -0.7 |
| 2666 | -0.7 |
| 2667 | -0.7 |
| 2668 | -0.73 |
| 2669 | -0.72 |
| 2670 | -0.72 |
| 2671 | -0.71 |
| 2672 | -0.64 |
| 2673 | -0.61 |
| 2674 | -0.6 |
| 2675 | -0.58 |
| 2676 | -0.56 |
| 2677 | -0.6 |
| 2678 | -0.61 |
| 2679 | -0.59 |
| 2680 | -0.64 |
| 2681 | -0.66 |
| 2682 | -0.67 |
| 2683 | -0.67 |
| 2684 | -0.68 |
| 2685 | -0.69 |
| 2686 | -0.67 |
| 2687 | -0.66 |
| 2688 | -0.68 |
| 2689 | -0.72 |
| 2690 | -0.74 |
| 2691 | -0.77 |
| 2692 | -0.77 |
| 2693 | -0.78 |
| 2694 | -0.82 |
| 2695 | -0.79 |
| 2696 | -0.78 |
| 2697 | -0.79 |
| 2698 | -0.8 |
| 2699 | -0.82 |
| 2700 | -0.84 |
| 2701 | -0.84 |
| 2702 | -0.85 |
| 2703 | -0.84 |
| 2704 | -0.82 |
| 2705 | -0.82 |
| 2706 | -0.85 |
| 2707 | -0.87 |
| 2708 | -0.88 |
| 2709 | -0.9 |
| 2710 | -0.91 |
| 2711 | -0.93 |
| 2712 | -0.94 |
| 2713 | -0.97 |
| 2714 | -1.01 |
| 2715 | -1.03 |
| 2716 | -1.03 |
| 2717 | -1.03 |
| 2718 | -1 |
| 2719 | -1.05 |
| 2720 | -1.05 |
| 2721 | -1.06 |
| 2722 | -1.04 |
| 2723 | -1.02 |
| 2724 | -1.05 |
| 2725 | -1.09 |
| 2726 | -1.11 |
| 2727 | -1.09 |
| 2728 | -1.12 |
| 2729 | -1.1 |
| 2730 | -1.11 |
| 2731 | -1.12 |
| 2732 | -1.1 |
| 2733 | -1.11 |
| 2734 | -1.11 |
| 2735 | -1.08 |
| 2736 | -1.03 |
| 2737 | -1.02 |
| 2738 | -1.02 |
| 2739 | -1.01 |
| 2740 | -0.98 |
| 2741 | -0.98 |
| 2742 | -0.97 |
| 2743 | -1.01 |
| 2744 | -1 |
| 2745 | -1.01 |
| 2746 | -1.06 |
| 2747 | -1.04 |
| 2748 | -1.04 |
| 2749 | -1.01 |
| 2750 | -1.02 |
| 2751 | -1.05 |
| 2752 | -1.04 |
| 2753 | -1.05 |
| 2754 | -1.05 |
| 2755 | -1.07 |
| 2756 | -1.05 |
| 2757 | -1.02 |
| 2758 | -1.04 |
| 2759 | -1.05 |
| 2760 | -1.04 |
| 2761 | -1.07 |
| 2762 | -1.06 |
| 2763 | -1.04 |
| 2764 | -1.03 |
| 2765 | -1.05 |
| 2766 | -1.04 |
| 2767 | -1.04 |
| 2768 | -1.04 |
| 2769 | -1.03 |
| 2770 | -1.03 |
| 2771 | -1.05 |
| 2772 | -1.09 |
| 2773 | -1.06 |
| 2774 | -1.06 |
| 2775 | -1.04 |
| 2776 | -1.02 |
| 2777 | -1.01 |
| 2778 | -1 |
| 2779 | -1 |
| 2780 | -0.97 |
| 2781 | -1 |
| 2782 | -0.97 |
| 2783 | -1 |
| 2784 | -1 |
| 2785 | -1.03 |
| 2786 | -1.02 |
| 2787 | -1 |
| 2788 | -0.99 |
| 2789 | -1.01 |
| 2790 | -1.03 |
| 2791 | -1.06 |
| 2792 | -1.05 |
| 2793 | -1.03 |
| 2794 | -1.05 |
| 2795 | -1.05 |
| 2796 | -1.08 |
| 2797 | -1.08 |
| 2798 | -1.12 |
| 2799 | -1.11 |
| 2800 | -1.14 |
| 2801 | -1.17 |
| 2802 | -1.16 |
| 2803 | -1.14 |
| 2804 | -1.18 |
| 2805 | -1.16 |
| 2806 | -1.18 |
| 2807 | -1.18 |
| 2808 | -1.2 |
| 2809 | -1.2 |
| 2810 | -1.15 |
| 2811 | -1.16 |
| 2812 | -1.18 |
| 2813 | -1.16 |
| 2814 | -1.16 |
| 2815 | -1.14 |
| 2816 | -1.14 |
| 2817 | -1.14 |
| 2818 | -1.13 |
| 2819 | -1.11 |
| 2820 | -1.12 |
| 2821 | -1.16 |
| 2822 | -1.11 |
| 2823 | -1.1 |
| 2824 | -1.09 |
| 2825 | -1.12 |
| 2826 | -1.11 |
| 2827 | -1.12 |
| 2828 | -1.11 |
| 2829 | -1.11 |
| 2830 | -1.14 |
| 2831 | -1.12 |
| 2832 | -1.1 |
| 2833 | -1.11 |
| 2834 | -1.12 |
| 2835 | -1.13 |
| 2836 | -1.12 |
| 2837 | -1.13 |
| 2838 | -1.14 |
| 2839 | -1.17 |
| 2840 | -1.16 |
| 2841 | -1.16 |
| 2842 | -1.14 |
| 2843 | -1.18 |
| 2844 | -1.13 |
| 2845 | -1.16 |
| 2846 | -1.18 |
| 2847 | -1.12 |
| 2848 | -1.09 |
| 2849 | -1.12 |
| 2850 | -1.13 |
| 2851 | -1.18 |
| 2852 | -1.16 |
| 2853 | -1.18 |
| 2854 | -1.16 |
| 2855 | -1.15 |
| 2856 | -1.15 |
| 2857 | -1.21 |
| 2858 | -1.2 |
| 2859 | -1.2 |
| 2860 | -1.2 |
| 2861 | -1.18 |
| 2862 | -1.23 |
| 2863 | -1.24 |
| 2864 | -1.24 |
| 2865 | -1.22 |
| 2866 | -1.2 |
| 2867 | -1.21 |
| 2868 | -1.24 |
| 2869 | -1.26 |
| 2870 | -1.29 |
| 2871 | -1.29 |
| 2872 | -1.3 |
| 2873 | -1.32 |
| 2874 | -1.34 |
| 2875 | -1.33 |
| 2876 | -1.33 |
| 2877 | -1.3 |
| 2878 | -1.33 |
| 2879 | -1.33 |
| 2880 | -1.35 |
| 2881 | -1.34 |
| 2882 | -1.36 |
| 2883 | -1.37 |
| 2884 | -1.36 |
| 2885 | -1.35 |
| 2886 | -1.37 |
| 2887 | -1.39 |
| 2888 | -1.44 |
| 2889 | -1.44 |
| 2890 | -1.46 |
| 2891 | -1.44 |
| 2892 | -1.46 |
| 2893 | -1.46 |
| 2894 | -1.44 |
| 2895 | -1.45 |
| 2896 | -1.46 |
| 2897 | -1.45 |
| 2898 | -1.47 |
| 2899 | -1.48 |
| 2900 | -1.49 |
| 2901 | -1.47 |
| 2902 | -1.49 |
| 2903 | -1.52 |
| 2904 | -1.51 |
| 2905 | -1.53 |
| 2906 | -1.54 |
| 2907 | -1.53 |
| 2908 | -1.52 |
| 2909 | -1.5 |
| 2910 | -1.52 |
| 2911 | -1.52 |
| 2912 | -1.54 |
| 2913 | -1.56 |
| 2914 | -1.56 |
| 2915 | -1.53 |
| 2916 | -1.54 |
| 2917 | -1.5 |
| 2918 | -1.52 |
| 2919 | -1.54 |
| 2920 | -1.53 |
| 2921 | -1.54 |
| 2922 | -1.55 |
| 2923 | -1.52 |
| 2924 | -1.5 |
| 2925 | -1.51 |
| 2926 | -1.51 |
| 2927 | -1.53 |
| 2928 | -1.49 |
| 2929 | -1.48 |
| 2930 | -1.49 |
| 2931 | -1.53 |
| 2932 | -1.51 |
| 2933 | -1.51 |
| 2934 | -1.52 |
| 2935 | -1.51 |
| 2936 | -1.46 |
| 2937 | -1.46 |
| 2938 | -1.44 |
| 2939 | -1.41 |
| 2940 | -1.44 |
| 2941 | -1.44 |
| 2942 | -1.44 |
| 2943 | -1.43 |
| 2944 | -1.41 |
| 2945 | -1.38 |
| 2946 | -1.36 |
| 2947 | -1.37 |
| 2948 | -1.35 |
| 2949 | -1.36 |
| 2950 | -1.35 |
| 2951 | -1.35 |
| 2952 | -1.34 |
| 2953 | -1.35 |
| 2954 | -1.33 |
| 2955 | -1.34 |
| 2956 | -1.32 |
| 2957 | -1.31 |
| 2958 | -1.32 |
| 2959 | -1.27 |
| 2960 | -1.29 |
| 2961 | -1.29 |
| 2962 | -1.29 |
| 2963 | -1.29 |
| 2964 | -1.31 |
| 2965 | -1.32 |
| 2966 | -1.35 |
| 2967 | -1.37 |
| 2968 | -1.34 |
| 2969 | -1.35 |
| 2970 | -1.36 |
| 2971 | -1.37 |
| 2972 | -1.37 |
| 2973 | -1.33 |
| 2974 | -1.32 |
| 2975 | -1.31 |
| 2976 | -1.3 |
| 2977 | -1.29 |
| 2978 | -1.31 |
| 2979 | -1.31 |
| 2980 | -1.31 |
| 2981 | -1.29 |
| 2982 | -1.27 |
| 2983 | -1.29 |
| 2984 | -1.31 |
| 2985 | -1.31 |
| 2986 | -1.33 |
| 2987 | -1.35 |
| 2988 | -1.34 |
| 2989 | -1.36 |
| 2990 | -1.37 |
| 2991 | -1.33 |
| 2992 | -1.36 |
| 2993 | -1.36 |
| 2994 | -1.32 |
| 2995 | -1.35 |
| 2996 | -1.38 |
| 2997 | -1.41 |
| 2998 | -1.4 |
| 2999 | -1.39 |
| 3000 | -1.38 |
| 3001 | -1.42 |
| 3002 | -1.42 |
| 3003 | -1.41 |
| 3004 | -1.43 |
| 3005 | -1.39 |
| 3006 | -1.42 |
| 3007 | -1.44 |
| 3008 | -1.48 |
| 3009 | -1.48 |
| 3010 | -1.49 |
| 3011 | -1.51 |
| 3012 | -1.53 |
| 3013 | -1.52 |
| 3014 | -1.52 |
| 3015 | -1.54 |
| 3016 | -1.53 |
| 3017 | -1.51 |
| 3018 | -1.55 |
| 3019 | -1.55 |
| 3020 | -1.59 |
| 3021 | -1.6 |
| 3022 | -1.6 |
| 3023 | -1.58 |
| 3024 | -1.58 |
| 3025 | -1.58 |
| 3026 | -1.59 |
| 3027 | -1.61 |
| 3028 | -1.61 |
| 3029 | -1.6 |
| 3030 | -1.62 |
| 3031 | -1.64 |
| 3032 | -1.66 |
| 3033 | -1.65 |
| 3034 | -1.65 |
| 3035 | -1.64 |
| 3036 | -1.67 |
| 3037 | -1.66 |
| 3038 | -1.63 |